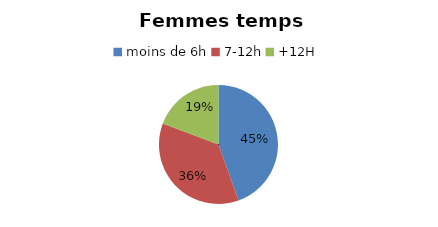
| Category | Femmes temps plein |
|---|---|
| moins de 6h | 44.54 |
| 7-12h | 36.19 |
| +12H | 19.27 |